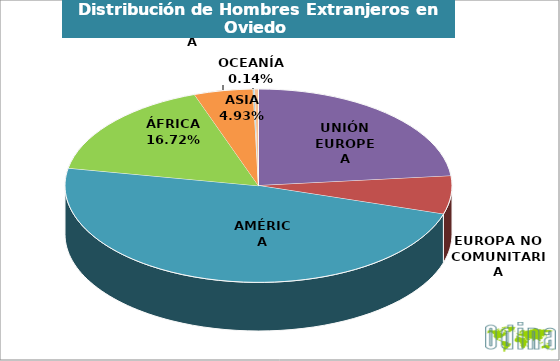
| Category | Hombres |
|---|---|
| UNIÓN EUROPEA | 1847 |
| EUROPA NO COMUNITARIA | 502 |
| AMÉRICA | 3799 |
| ÁFRICA | 1319 |
| ASIA | 389 |
| OCEANÍA | 11 |
| APÁTRIDA | 24 |